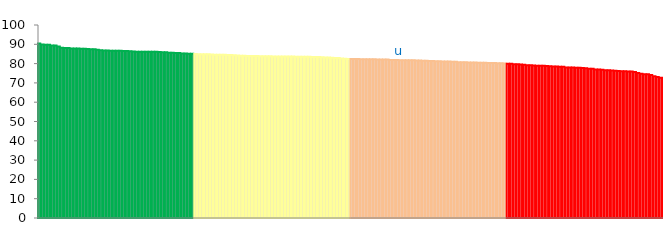
| Category | Top Quartile | 2nd Quartile | 3rd Quartile | Bottom Quartile | Series 4 |
|---|---|---|---|---|---|
|  | 90.45 | 0 | 0 | 0 | 90.45 |
|  | 89.878 | 0 | 0 | 0 | 89.878 |
|  | 89.804 | 0 | 0 | 0 | 89.804 |
|  | 89.75 | 0 | 0 | 0 | 89.75 |
|  | 89.411 | 0 | 0 | 0 | 89.411 |
|  | 89.386 | 0 | 0 | 0 | 89.386 |
|  | 88.85 | 0 | 0 | 0 | 88.85 |
|  | 88.155 | 0 | 0 | 0 | 88.155 |
|  | 88.115 | 0 | 0 | 0 | 88.115 |
|  | 88.091 | 0 | 0 | 0 | 88.091 |
|  | 87.858 | 0 | 0 | 0 | 87.858 |
|  | 87.85 | 0 | 0 | 0 | 87.85 |
|  | 87.778 | 0 | 0 | 0 | 87.778 |
|  | 87.667 | 0 | 0 | 0 | 87.667 |
|  | 87.648 | 0 | 0 | 0 | 87.648 |
|  | 87.529 | 0 | 0 | 0 | 87.529 |
|  | 87.494 | 0 | 0 | 0 | 87.494 |
|  | 87.469 | 0 | 0 | 0 | 87.469 |
|  | 87.157 | 0 | 0 | 0 | 87.157 |
|  | 86.933 | 0 | 0 | 0 | 86.933 |
|  | 86.791 | 0 | 0 | 0 | 86.791 |
|  | 86.767 | 0 | 0 | 0 | 86.767 |
|  | 86.691 | 0 | 0 | 0 | 86.691 |
|  | 86.676 | 0 | 0 | 0 | 86.676 |
|  | 86.614 | 0 | 0 | 0 | 86.614 |
|  | 86.607 | 0 | 0 | 0 | 86.607 |
|  | 86.591 | 0 | 0 | 0 | 86.591 |
|  | 86.535 | 0 | 0 | 0 | 86.535 |
|  | 86.369 | 0 | 0 | 0 | 86.369 |
|  | 86.323 | 0 | 0 | 0 | 86.323 |
|  | 86.184 | 0 | 0 | 0 | 86.184 |
|  | 86.169 | 0 | 0 | 0 | 86.169 |
|  | 86.166 | 0 | 0 | 0 | 86.166 |
|  | 86.159 | 0 | 0 | 0 | 86.159 |
|  | 86.128 | 0 | 0 | 0 | 86.128 |
|  | 86.124 | 0 | 0 | 0 | 86.124 |
|  | 86.085 | 0 | 0 | 0 | 86.085 |
|  | 86.064 | 0 | 0 | 0 | 86.064 |
|  | 85.907 | 0 | 0 | 0 | 85.907 |
|  | 85.854 | 0 | 0 | 0 | 85.854 |
|  | 85.676 | 0 | 0 | 0 | 85.676 |
|  | 85.575 | 0 | 0 | 0 | 85.575 |
|  | 85.542 | 0 | 0 | 0 | 85.542 |
|  | 85.47 | 0 | 0 | 0 | 85.47 |
|  | 85.248 | 0 | 0 | 0 | 85.248 |
|  | 85.215 | 0 | 0 | 0 | 85.215 |
|  | 85.077 | 0 | 0 | 0 | 85.077 |
|  | 85.054 | 0 | 0 | 0 | 85.054 |
|  | 0 | 85.027 | 0 | 0 | 85.027 |
|  | 0 | 84.856 | 0 | 0 | 84.856 |
|  | 0 | 84.823 | 0 | 0 | 84.823 |
|  | 0 | 84.809 | 0 | 0 | 84.809 |
|  | 0 | 84.79 | 0 | 0 | 84.79 |
|  | 0 | 84.721 | 0 | 0 | 84.721 |
|  | 0 | 84.649 | 0 | 0 | 84.649 |
|  | 0 | 84.596 | 0 | 0 | 84.596 |
|  | 0 | 84.593 | 0 | 0 | 84.593 |
|  | 0 | 84.546 | 0 | 0 | 84.546 |
|  | 0 | 84.445 | 0 | 0 | 84.445 |
|  | 0 | 84.393 | 0 | 0 | 84.393 |
|  | 0 | 84.33 | 0 | 0 | 84.33 |
|  | 0 | 84.21 | 0 | 0 | 84.21 |
|  | 0 | 84.087 | 0 | 0 | 84.087 |
|  | 0 | 84.019 | 0 | 0 | 84.019 |
|  | 0 | 83.965 | 0 | 0 | 83.965 |
|  | 0 | 83.903 | 0 | 0 | 83.903 |
|  | 0 | 83.884 | 0 | 0 | 83.884 |
|  | 0 | 83.876 | 0 | 0 | 83.876 |
|  | 0 | 83.863 | 0 | 0 | 83.863 |
|  | 0 | 83.842 | 0 | 0 | 83.842 |
|  | 0 | 83.83 | 0 | 0 | 83.83 |
|  | 0 | 83.768 | 0 | 0 | 83.768 |
|  | 0 | 83.734 | 0 | 0 | 83.734 |
|  | 0 | 83.692 | 0 | 0 | 83.692 |
|  | 0 | 83.688 | 0 | 0 | 83.688 |
|  | 0 | 83.685 | 0 | 0 | 83.685 |
|  | 0 | 83.663 | 0 | 0 | 83.663 |
|  | 0 | 83.647 | 0 | 0 | 83.647 |
|  | 0 | 83.634 | 0 | 0 | 83.634 |
|  | 0 | 83.547 | 0 | 0 | 83.547 |
|  | 0 | 83.542 | 0 | 0 | 83.542 |
|  | 0 | 83.532 | 0 | 0 | 83.532 |
|  | 0 | 83.515 | 0 | 0 | 83.515 |
|  | 0 | 83.504 | 0 | 0 | 83.504 |
|  | 0 | 83.439 | 0 | 0 | 83.439 |
|  | 0 | 83.403 | 0 | 0 | 83.403 |
|  | 0 | 83.37 | 0 | 0 | 83.37 |
|  | 0 | 83.279 | 0 | 0 | 83.279 |
|  | 0 | 83.147 | 0 | 0 | 83.147 |
|  | 0 | 83.097 | 0 | 0 | 83.097 |
|  | 0 | 83.007 | 0 | 0 | 83.007 |
|  | 0 | 82.96 | 0 | 0 | 82.96 |
|  | 0 | 82.892 | 0 | 0 | 82.892 |
|  | 0 | 82.613 | 0 | 0 | 82.613 |
|  | 0 | 82.576 | 0 | 0 | 82.576 |
|  | 0 | 82.399 | 0 | 0 | 82.399 |
|  | 0 | 0 | 82.398 | 0 | 82.398 |
|  | 0 | 0 | 82.385 | 0 | 82.385 |
|  | 0 | 0 | 82.369 | 0 | 82.369 |
|  | 0 | 0 | 82.305 | 0 | 82.305 |
|  | 0 | 0 | 82.286 | 0 | 82.286 |
|  | 0 | 0 | 82.263 | 0 | 82.263 |
|  | 0 | 0 | 82.233 | 0 | 82.233 |
|  | 0 | 0 | 82.232 | 0 | 82.232 |
|  | 0 | 0 | 82.166 | 0 | 82.166 |
|  | 0 | 0 | 82.163 | 0 | 82.163 |
|  | 0 | 0 | 82.145 | 0 | 82.145 |
|  | 0 | 0 | 82.07 | 0 | 82.07 |
|  | 0 | 0 | 81.903 | 0 | 81.903 |
|  | 0 | 0 | 81.855 | 0 | 81.855 |
|  | 0 | 0 | 81.826 | 0 | 81.826 |
| u | 0 | 0 | 81.775 | 0 | 81.775 |